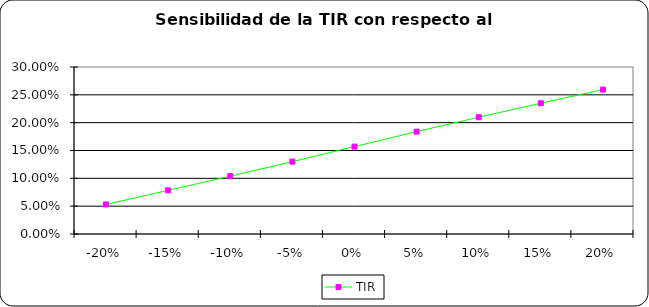
| Category | TIR |
|---|---|
| -0.2 | 0.053 |
| -0.15 | 0.078 |
| -0.1 | 0.104 |
| -0.05 | 0.13 |
| 0.0 | 0.157 |
| 0.05 | 0.184 |
| 0.1 | 0.21 |
| 0.15 | 0.235 |
| 0.2 | 0.259 |